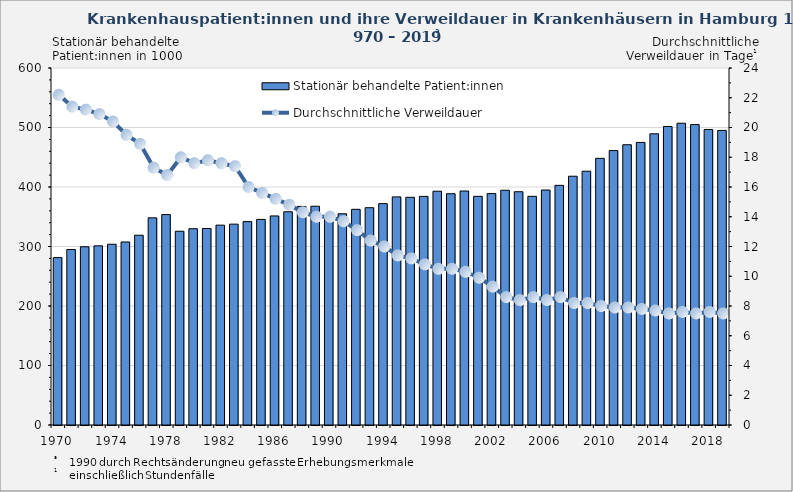
| Category | Stationär behandelte Patient:innen |
|---|---|
| 1970.0 | 281.312 |
| 1971.0 | 294.952 |
| 1972.0 | 299.555 |
| 1973.0 | 301.055 |
| 1974.0 | 303.829 |
| 1975.0 | 307.63 |
| 1976.0 | 318.934 |
| 1977.0 | 348.175 |
| 1978.0 | 353.637 |
| 1979.0 | 325.626 |
| 1980.0 | 329.893 |
| 1981.0 | 330.246 |
| 1982.0 | 335.871 |
| 1983.0 | 337.57 |
| 1984.0 | 341.85 |
| 1985.0 | 345.524 |
| 1986.0 | 351.37 |
| 1987.0 | 358.339 |
| 1988.0 | 367.336 |
| 1989.0 | 367.653 |
| 1990.0 | 348.744 |
| 1991.0 | 354.995 |
| 1992.0 | 362.481 |
| 1993.0 | 365.226 |
| 1994.0 | 372.023 |
| 1995.0 | 383.376 |
| 1996.0 | 382.688 |
| 1997.0 | 384.208 |
| 1998.0 | 392.887 |
| 1999.0 | 388.698 |
| 2000.0 | 393.274 |
| 2001.0 | 384.306 |
| 2002.0 | 388.926 |
| 2003.0 | 394.554 |
| 2004.0 | 392.057 |
| 2005.0 | 384.3 |
| 2006.0 | 394.933 |
| 2007.0 | 402.754 |
| 2008.0 | 418.109 |
| 2009.0 | 426.547 |
| 2010.0 | 448.176 |
| 2011.0 | 461.221 |
| 2012.0 | 471.009 |
| 2013.0 | 474.898 |
| 2014.0 | 489.391 |
| 2015.0 | 501.704 |
| 2016.0 | 507.159 |
| 2017.0 | 504.888 |
| 2018.0 | 496.708 |
| 2019.0 | 495.099 |